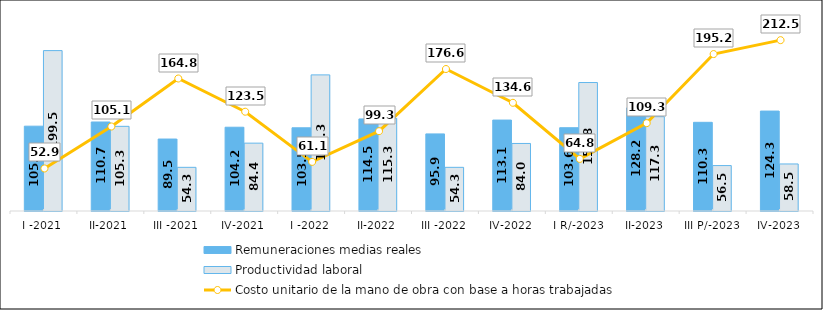
| Category | Remuneraciones medias reales  | Productividad laboral |
|---|---|---|
| I -2021 | 105.5 | 199.5 |
| II-2021 | 110.7 | 105.3 |
| III -2021 | 89.5 | 54.3 |
| IV-2021 | 104.2 | 84.4 |
| I -2022 | 103.5 | 169.3 |
| II-2022 | 114.5 | 115.3 |
| III -2022 | 95.9 | 54.3 |
| IV-2022 | 113.1 | 84 |
| I R/-2023 | 103.6 | 159.8 |
| II-2023 | 128.2 | 117.3 |
| III P/-2023 | 110.3 | 56.5 |
| IV-2023 | 124.3 | 58.5 |